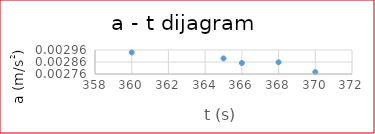
| Category | a (m/s2) |
|---|---|
| 360.0 | 0.003 |
| 366.0 | 0.003 |
| 365.0 | 0.003 |
| 370.0 | 0.003 |
| 368.0 | 0.003 |